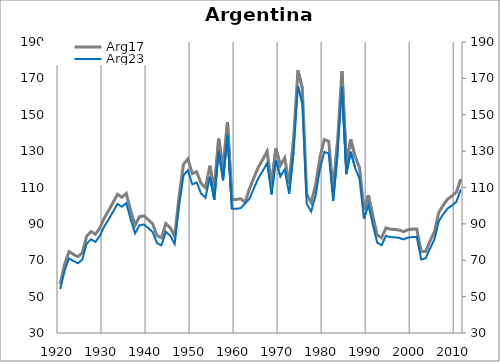
| Category | Arg17 |
|---|---|
| 1920.0 | 56.988 |
| 1921.0 | 67.692 |
| 1922.0 | 74.778 |
| 1923.0 | 73.271 |
| 1924.0 | 71.914 |
| 1925.0 | 74.025 |
| 1926.0 | 83.221 |
| 1927.0 | 85.784 |
| 1928.0 | 84.276 |
| 1929.0 | 87.744 |
| 1930.0 | 93.171 |
| 1931.0 | 97.353 |
| 1932.0 | 101.722 |
| 1933.0 | 106.288 |
| 1934.0 | 104.629 |
| 1935.0 | 106.74 |
| 1936.0 | 97.393 |
| 1937.0 | 89.252 |
| 1938.0 | 93.925 |
| 1939.0 | 94.377 |
| 1940.0 | 92.267 |
| 1941.0 | 90.005 |
| 1942.0 | 83.523 |
| 1943.0 | 82.316 |
| 1944.0 | 90.156 |
| 1945.0 | 87.895 |
| 1946.0 | 83.07 |
| 1947.0 | 105.082 |
| 1948.0 | 122.721 |
| 1949.0 | 125.736 |
| 1950.0 | 117.595 |
| 1951.0 | 118.65 |
| 1952.0 | 112.318 |
| 1953.0 | 109.906 |
| 1954.0 | 121.967 |
| 1955.0 | 108.624 |
| 1956.0 | 136.862 |
| 1957.0 | 119.917 |
| 1958.0 | 145.944 |
| 1959.0 | 103.464 |
| 1960.0 | 103.448 |
| 1961.0 | 103.834 |
| 1962.0 | 101.912 |
| 1963.0 | 109.329 |
| 1964.0 | 115.375 |
| 1965.0 | 121.116 |
| 1966.0 | 125.317 |
| 1967.0 | 129.943 |
| 1968.0 | 111.746 |
| 1969.0 | 131.548 |
| 1970.0 | 122.111 |
| 1971.0 | 126.307 |
| 1972.0 | 112.126 |
| 1973.0 | 136.12 |
| 1974.0 | 174.441 |
| 1975.0 | 164.676 |
| 1976.0 | 106.381 |
| 1977.0 | 101.794 |
| 1978.0 | 110.968 |
| 1979.0 | 126.503 |
| 1980.0 | 136.416 |
| 1981.0 | 135.381 |
| 1982.0 | 108.009 |
| 1983.0 | 135.085 |
| 1984.0 | 173.997 |
| 1985.0 | 123.525 |
| 1986.0 | 136.445 |
| 1987.0 | 127.026 |
| 1988.0 | 120.748 |
| 1989.0 | 97.806 |
| 1990.0 | 105.775 |
| 1991.0 | 94.545 |
| 1992.0 | 83.92 |
| 1993.0 | 82.35 |
| 1994.0 | 87.784 |
| 1995.0 | 87.059 |
| 1996.0 | 86.938 |
| 1997.0 | 86.576 |
| 1998.0 | 85.731 |
| 1999.0 | 86.818 |
| 2000.0 | 87.084 |
| 2001.0 | 87.201 |
| 2002.0 | 74.793 |
| 2003.0 | 74.744 |
| 2004.0 | 80.439 |
| 2005.0 | 85.665 |
| 2006.0 | 96.29 |
| 2007.0 | 100.305 |
| 2008.0 | 103.589 |
| 2009.0 | 105.401 |
| 2010.0 | 107.486 |
| 2011.0 | 114.645 |